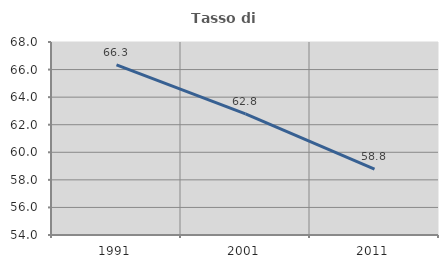
| Category | Tasso di occupazione   |
|---|---|
| 1991.0 | 66.346 |
| 2001.0 | 62.78 |
| 2011.0 | 58.776 |